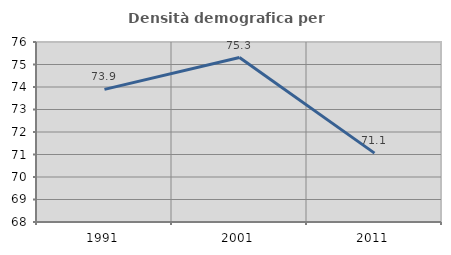
| Category | Densità demografica |
|---|---|
| 1991.0 | 73.893 |
| 2001.0 | 75.308 |
| 2011.0 | 71.062 |